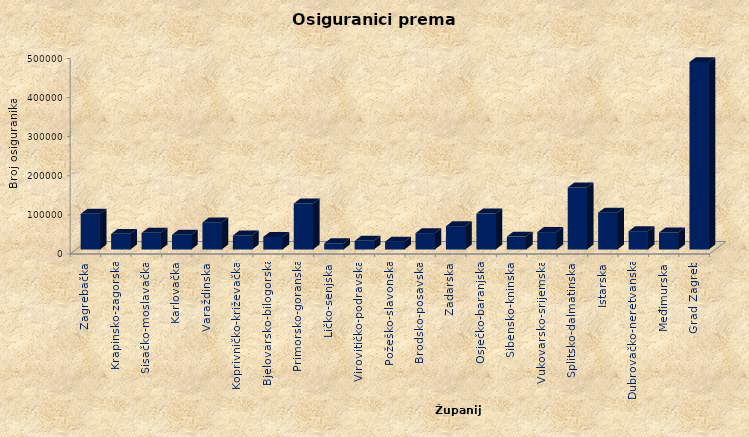
| Category | Series 0 |
|---|---|
| Zagrebačka | 91146 |
| Krapinsko-zagorska | 39948 |
| Sisačko-moslavačka | 42539 |
| Karlovačka | 37702 |
| Varaždinska | 69245 |
| Koprivničko-križevačka | 35876 |
| Bjelovarsko-bilogorska | 32235 |
| Primorsko-goranska | 117475 |
| Ličko-senjska | 15813 |
| Virovitičko-podravska | 22093 |
| Požeško-slavonska | 20097 |
| Brodsko-posavska | 41806 |
| Zadarska | 59652 |
| Osječko-baranjska | 91893 |
| Šibensko-kninska | 32927 |
| Vukovarsko-srijemska | 44497 |
| Splitsko-dalmatinska | 158489 |
| Istarska | 94198 |
| Dubrovačko-neretvanska | 46788 |
| Međimurska | 43459 |
| Grad Zagreb | 479128 |